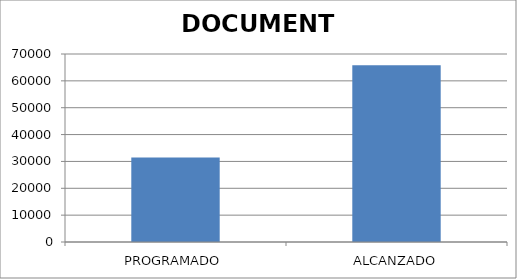
| Category | DOCUMENTO |
|---|---|
| PROGRAMADO | 31500 |
| ALCANZADO | 65814 |